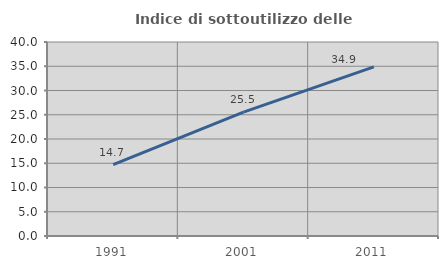
| Category | Indice di sottoutilizzo delle abitazioni  |
|---|---|
| 1991.0 | 14.696 |
| 2001.0 | 25.536 |
| 2011.0 | 34.863 |